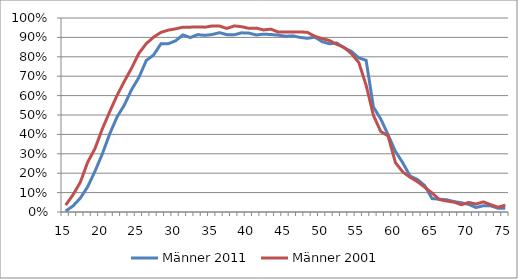
| Category | Männer 2011 | Männer 2001 |
|---|---|---|
| 15.0 | 0.005 | 0.035 |
| 16.0 | 0.031 | 0.088 |
| 17.0 | 0.071 | 0.153 |
| 18.0 | 0.13 | 0.256 |
| 19.0 | 0.21 | 0.327 |
| 20.0 | 0.299 | 0.428 |
| 21.0 | 0.401 | 0.516 |
| 22.0 | 0.489 | 0.6 |
| 23.0 | 0.551 | 0.673 |
| 24.0 | 0.631 | 0.742 |
| 25.0 | 0.694 | 0.818 |
| 26.0 | 0.781 | 0.868 |
| 27.0 | 0.809 | 0.901 |
| 28.0 | 0.867 | 0.926 |
| 29.0 | 0.867 | 0.938 |
| 30.0 | 0.882 | 0.944 |
| 31.0 | 0.913 | 0.953 |
| 32.0 | 0.899 | 0.953 |
| 33.0 | 0.914 | 0.954 |
| 34.0 | 0.911 | 0.953 |
| 35.0 | 0.915 | 0.959 |
| 36.0 | 0.924 | 0.958 |
| 37.0 | 0.914 | 0.946 |
| 38.0 | 0.913 | 0.959 |
| 39.0 | 0.924 | 0.955 |
| 40.0 | 0.922 | 0.947 |
| 41.0 | 0.913 | 0.948 |
| 42.0 | 0.917 | 0.938 |
| 43.0 | 0.915 | 0.943 |
| 44.0 | 0.912 | 0.928 |
| 45.0 | 0.906 | 0.928 |
| 46.0 | 0.908 | 0.928 |
| 47.0 | 0.9 | 0.928 |
| 48.0 | 0.895 | 0.926 |
| 49.0 | 0.901 | 0.906 |
| 50.0 | 0.878 | 0.894 |
| 51.0 | 0.867 | 0.884 |
| 52.0 | 0.871 | 0.864 |
| 53.0 | 0.846 | 0.849 |
| 54.0 | 0.828 | 0.816 |
| 55.0 | 0.794 | 0.771 |
| 56.0 | 0.782 | 0.654 |
| 57.0 | 0.541 | 0.498 |
| 58.0 | 0.479 | 0.415 |
| 59.0 | 0.398 | 0.392 |
| 60.0 | 0.312 | 0.255 |
| 61.0 | 0.254 | 0.207 |
| 62.0 | 0.185 | 0.179 |
| 63.0 | 0.168 | 0.156 |
| 64.0 | 0.136 | 0.128 |
| 65.0 | 0.069 | 0.098 |
| 66.0 | 0.066 | 0.064 |
| 67.0 | 0.063 | 0.057 |
| 68.0 | 0.054 | 0.051 |
| 69.0 | 0.048 | 0.038 |
| 70.0 | 0.039 | 0.049 |
| 71.0 | 0.023 | 0.041 |
| 72.0 | 0.032 | 0.052 |
| 73.0 | 0.032 | 0.038 |
| 74.0 | 0.02 | 0.025 |
| 75.0 | 0.019 | 0.035 |